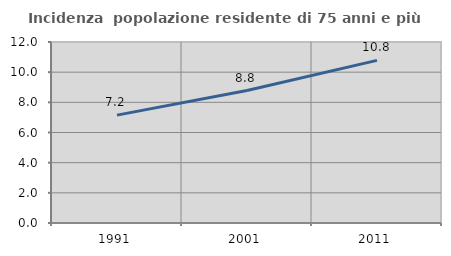
| Category | Incidenza  popolazione residente di 75 anni e più |
|---|---|
| 1991.0 | 7.151 |
| 2001.0 | 8.783 |
| 2011.0 | 10.782 |